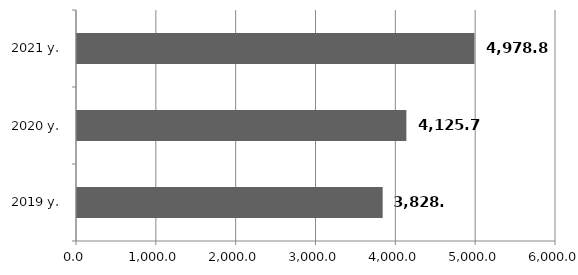
| Category | Series 0 |
|---|---|
| 2019 y. | 3828.83 |
| 2020 y. | 4125.7 |
| 2021 y. | 4978.8 |